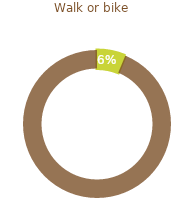
| Category | Walk or bike |
|---|---|
| 0 | 0.062 |
| 1 | 0.938 |